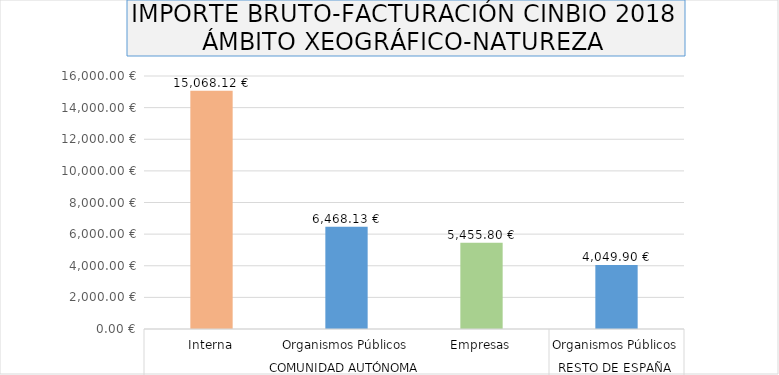
| Category | Series 0 |
|---|---|
| 0 | 15068.12 |
| 1 | 6468.13 |
| 2 | 5455.8 |
| 3 | 4049.9 |